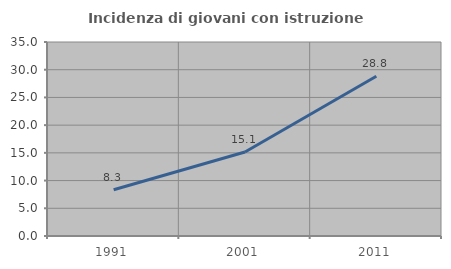
| Category | Incidenza di giovani con istruzione universitaria |
|---|---|
| 1991.0 | 8.34 |
| 2001.0 | 15.149 |
| 2011.0 | 28.826 |